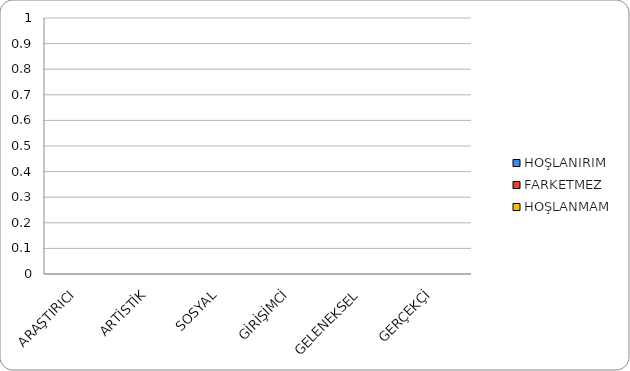
| Category | HOŞLANIRIM | FARKETMEZ | HOŞLANMAM |
|---|---|---|---|
| ARAŞTIRICI | 0 | 0 | 0 |
| ARTİSTİK | 0 | 0 | 0 |
| SOSYAL | 0 | 0 | 0 |
| GİRİŞİMCİ | 0 | 0 | 0 |
| GELENEKSEL | 0 | 0 | 0 |
| GERÇEKÇİ | 0 | 0 | 0 |